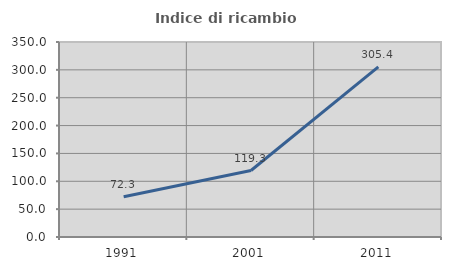
| Category | Indice di ricambio occupazionale  |
|---|---|
| 1991.0 | 72.268 |
| 2001.0 | 119.298 |
| 2011.0 | 305.426 |